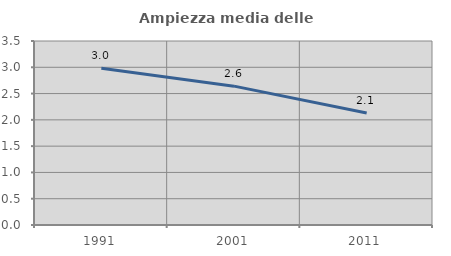
| Category | Ampiezza media delle famiglie |
|---|---|
| 1991.0 | 2.981 |
| 2001.0 | 2.641 |
| 2011.0 | 2.13 |